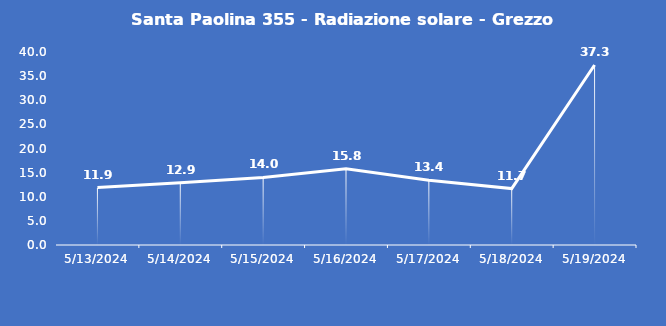
| Category | Santa Paolina 355 - Radiazione solare - Grezzo (W/m2) |
|---|---|
| 5/13/24 | 11.9 |
| 5/14/24 | 12.9 |
| 5/15/24 | 14 |
| 5/16/24 | 15.8 |
| 5/17/24 | 13.4 |
| 5/18/24 | 11.7 |
| 5/19/24 | 37.3 |